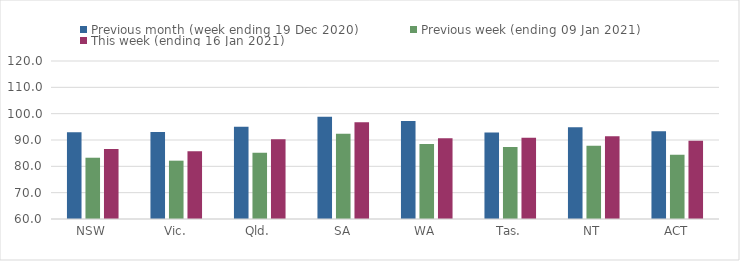
| Category | Previous month (week ending 19 Dec 2020) | Previous week (ending 09 Jan 2021) | This week (ending 16 Jan 2021) |
|---|---|---|---|
| NSW | 92.95 | 83.27 | 86.6 |
| Vic. | 93.07 | 82.15 | 85.76 |
| Qld. | 95 | 85.19 | 90.32 |
| SA | 98.8 | 92.33 | 96.75 |
| WA | 97.26 | 88.48 | 90.62 |
| Tas. | 92.87 | 87.3 | 90.82 |
| NT | 94.83 | 87.84 | 91.45 |
| ACT | 93.37 | 84.43 | 89.68 |